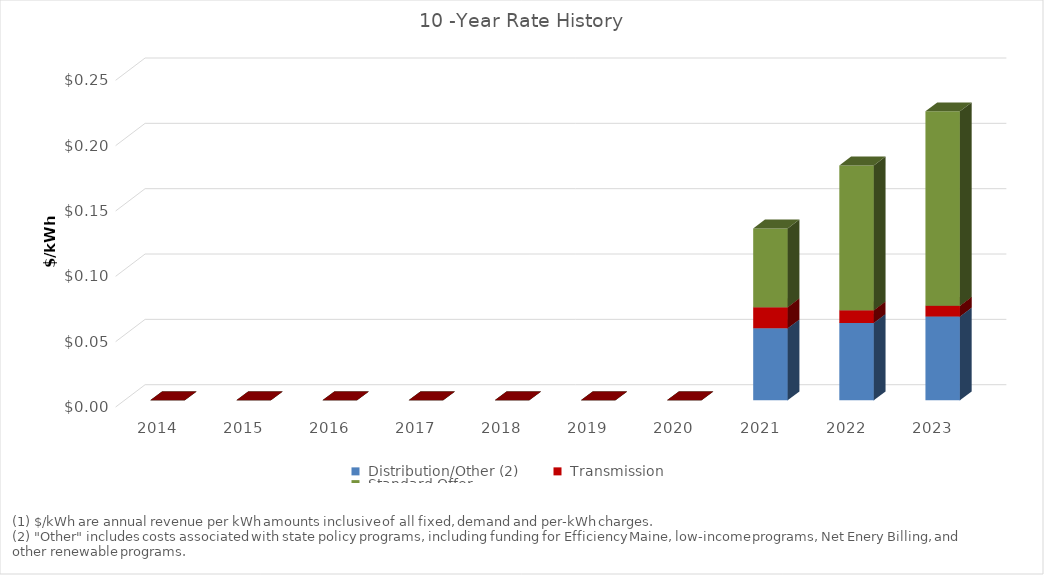
| Category | Series 1 | Series 2 | Series 3 |
|---|---|---|---|
| 2014.0 | 0 | 0 | 0 |
| 2015.0 | 0 | 0 | 0 |
| 2016.0 | 0 | 0 | 0 |
| 2017.0 | 0 | 0 | 0 |
| 2018.0 | 0 | 0 | 0 |
| 2019.0 | 0 | 0 | 0 |
| 2020.0 | 0 | 0 | 0 |
| 2021.0 | 0.055 | 0.016 | 0.06 |
| 2022.0 | 0.059 | 0.01 | 0.111 |
| 2023.0 | 0.064 | 0.008 | 0.149 |